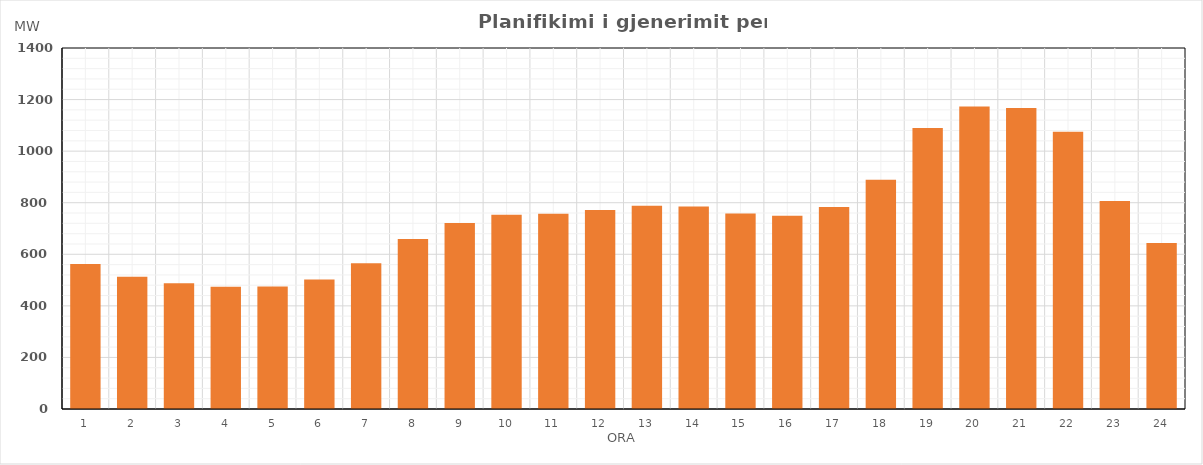
| Category | Max (MW) |
|---|---|
| 0 | 561.85 |
| 1 | 512.47 |
| 2 | 487.85 |
| 3 | 474 |
| 4 | 474.85 |
| 5 | 502.05 |
| 6 | 565.02 |
| 7 | 659.63 |
| 8 | 721.65 |
| 9 | 753.65 |
| 10 | 757.64 |
| 11 | 771.65 |
| 12 | 788.02 |
| 13 | 784.84 |
| 14 | 758.06 |
| 15 | 749.64 |
| 16 | 783.81 |
| 17 | 889.33 |
| 18 | 1090.19 |
| 19 | 1172.95 |
| 20 | 1167.38 |
| 21 | 1075.05 |
| 22 | 806.31 |
| 23 | 643.63 |